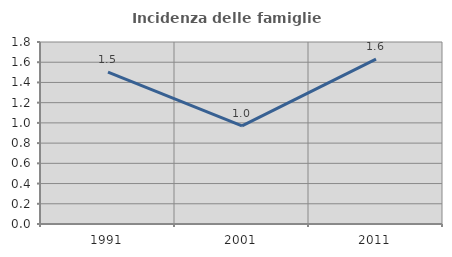
| Category | Incidenza delle famiglie numerose |
|---|---|
| 1991.0 | 1.502 |
| 2001.0 | 0.97 |
| 2011.0 | 1.63 |